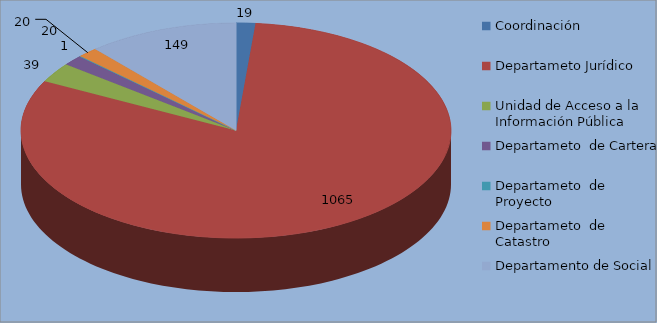
| Category | Series 0 |
|---|---|
| Coordinación | 19 |
| Departameto Jurídico  | 1065 |
| Unidad de Acceso a la Información Pública | 39 |
| Departameto  de Cartera | 20 |
| Departameto  de Proyecto | 1 |
| Departameto  de Catastro | 20 |
| Departamento de Social | 149 |